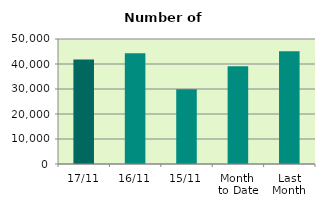
| Category | Series 0 |
|---|---|
| 17/11 | 41760 |
| 16/11 | 44256 |
| 15/11 | 29908 |
| Month 
to Date | 39122.154 |
| Last
Month | 45060.857 |